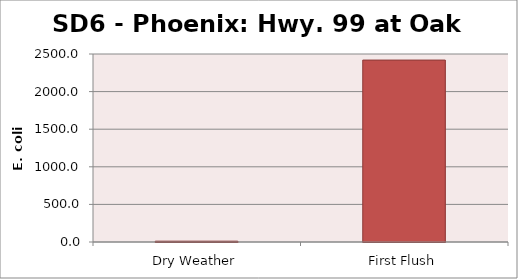
| Category | E. coli MPN |
|---|---|
| Dry Weather | 11 |
| First Flush | 2419.2 |